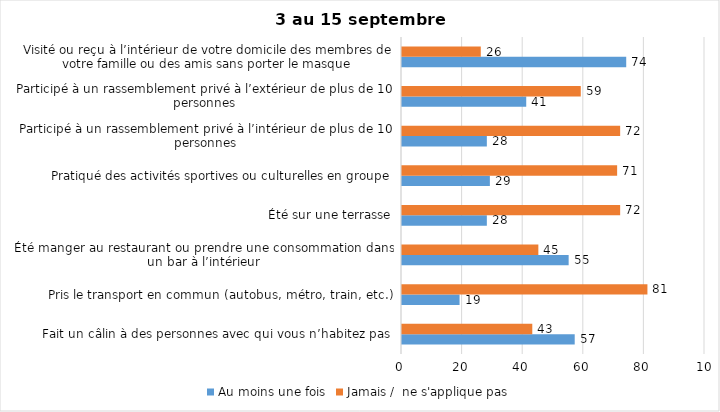
| Category | Au moins une fois | Jamais /  ne s'applique pas |
|---|---|---|
| Fait un câlin à des personnes avec qui vous n’habitez pas | 57 | 43 |
| Pris le transport en commun (autobus, métro, train, etc.) | 19 | 81 |
| Été manger au restaurant ou prendre une consommation dans un bar à l’intérieur | 55 | 45 |
| Été sur une terrasse | 28 | 72 |
| Pratiqué des activités sportives ou culturelles en groupe | 29 | 71 |
| Participé à un rassemblement privé à l’intérieur de plus de 10 personnes | 28 | 72 |
| Participé à un rassemblement privé à l’extérieur de plus de 10 personnes | 41 | 59 |
| Visité ou reçu à l’intérieur de votre domicile des membres de votre famille ou des amis sans porter le masque | 74 | 26 |